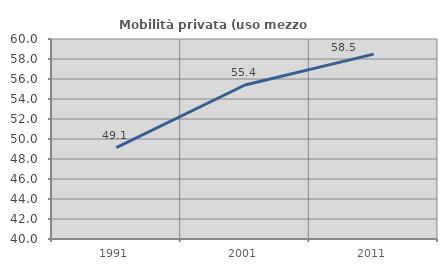
| Category | Mobilità privata (uso mezzo privato) |
|---|---|
| 1991.0 | 49.145 |
| 2001.0 | 55.401 |
| 2011.0 | 58.491 |